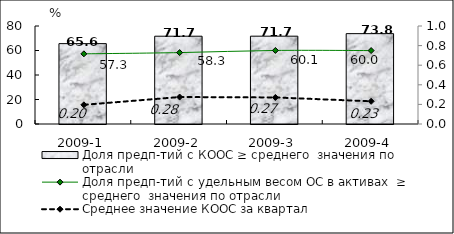
| Category | Доля предп-тий с КООС ≥ среднего  значения по отрасли |
|---|---|
| 2009-1 | 65.61 |
| 2009-2 | 71.67 |
| 2009-3 | 71.69 |
| 2009-4 | 73.76 |